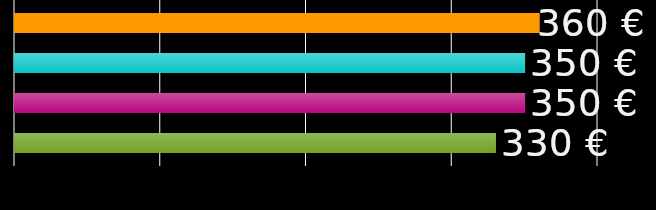
| Category | sostanovalec 1 | sostanovalec 2 | sostanovalec 3 | sostanovalec 4 |
|---|---|---|---|---|
| 0 | 360 | 350 | 350 | 330 |